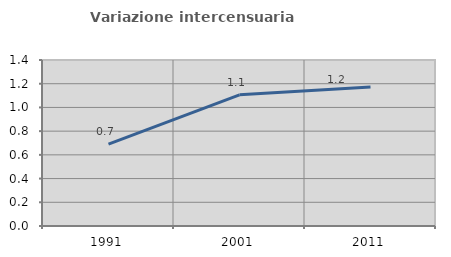
| Category | Variazione intercensuaria annua |
|---|---|
| 1991.0 | 0.69 |
| 2001.0 | 1.106 |
| 2011.0 | 1.173 |